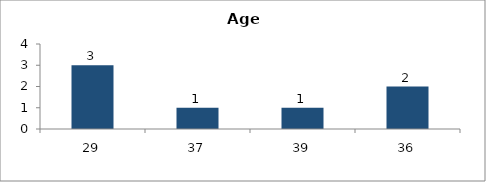
| Category | Age |
|---|---|
| 29.0 | 3 |
| 37.0 | 1 |
| 39.0 | 1 |
| 36.0 | 2 |